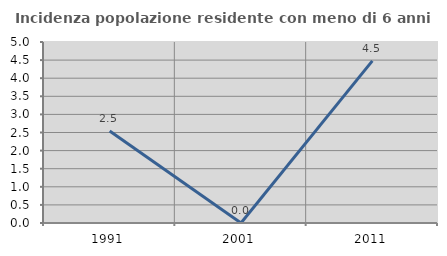
| Category | Incidenza popolazione residente con meno di 6 anni |
|---|---|
| 1991.0 | 2.542 |
| 2001.0 | 0 |
| 2011.0 | 4.478 |